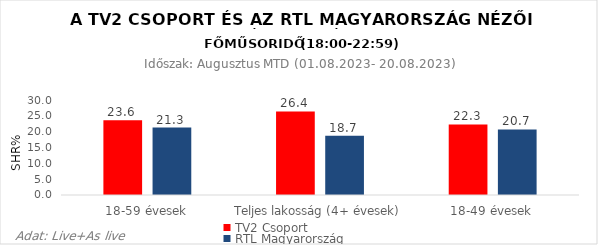
| Category | TV2 Csoport | RTL Magyarország |
|---|---|---|
| 18-59 évesek | 23.6 | 21.3 |
| Teljes lakosság (4+ évesek) | 26.4 | 18.7 |
| 18-49 évesek | 22.3 | 20.7 |